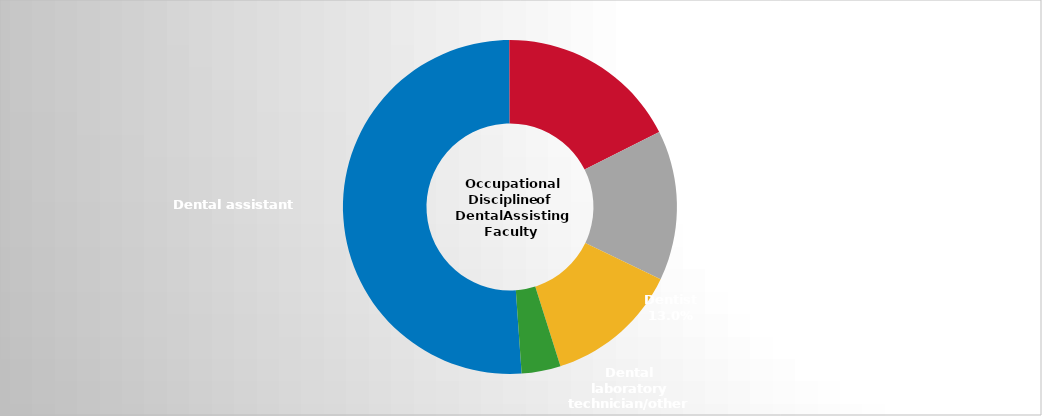
| Category | Series 2 |
|---|---|
| Dental assistant   | 0.51 |
| Dental hygienist | 0.177 |
| Both dental hygienist and dental assistant | 0.145 |
| Dentist | 0.13 |
| Dental laboratory technician/other | 0.038 |